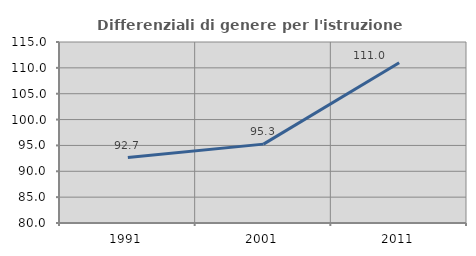
| Category | Differenziali di genere per l'istruzione superiore |
|---|---|
| 1991.0 | 92.654 |
| 2001.0 | 95.253 |
| 2011.0 | 110.983 |